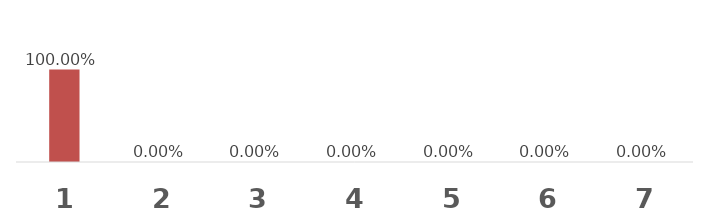
| Category | Series 1 |
|---|---|
| 0 | 1 |
| 1 | 0 |
| 2 | 0 |
| 3 | 0 |
| 4 | 0 |
| 5 | 0 |
| 6 | 0 |